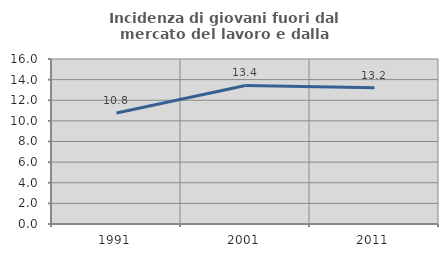
| Category | Incidenza di giovani fuori dal mercato del lavoro e dalla formazione  |
|---|---|
| 1991.0 | 10.762 |
| 2001.0 | 13.436 |
| 2011.0 | 13.202 |